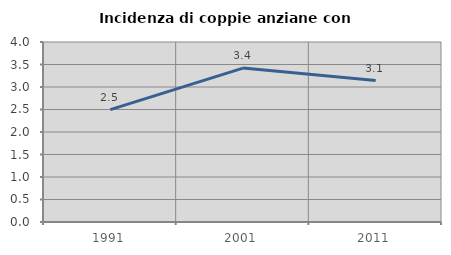
| Category | Incidenza di coppie anziane con figli |
|---|---|
| 1991.0 | 2.497 |
| 2001.0 | 3.42 |
| 2011.0 | 3.142 |